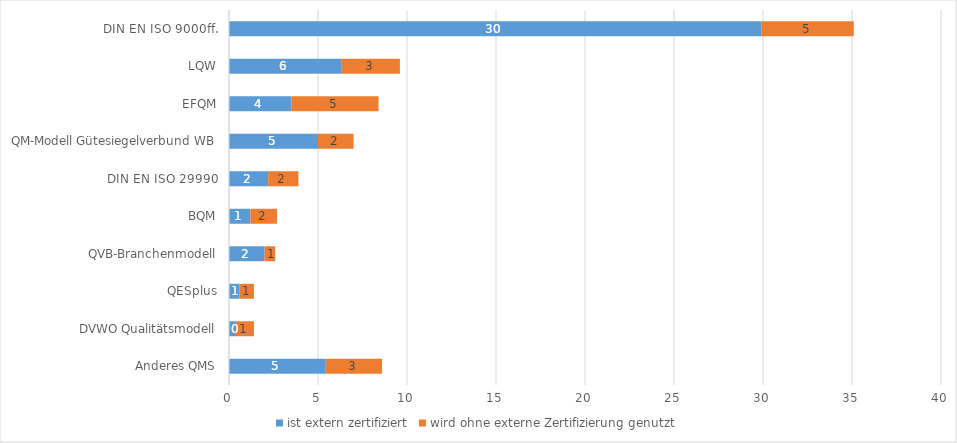
| Category | ist extern zertifiziert | wird ohne externe Zertifizierung genutzt |
|---|---|---|
| Anderes QMS | 5.4 | 3.2 |
| DVWO Qualitätsmodell | 0.4 | 1 |
| QESplus | 0.6 | 0.8 |
| QVB-Branchenmodell | 2 | 0.6 |
| BQM | 1.2 | 1.5 |
| DIN EN ISO 29990 | 2.2 | 1.7 |
| QM-Modell Gütesiegelverbund WB | 5 | 2 |
| EFQM | 3.5 | 4.9 |
| LQW | 6.3 | 3.3 |
| DIN EN ISO 9000ff. | 29.9 | 5.2 |